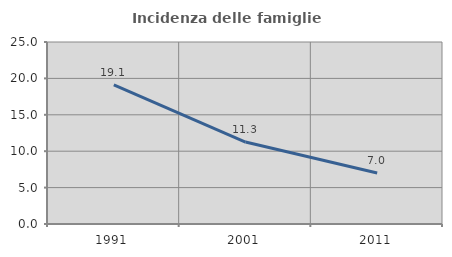
| Category | Incidenza delle famiglie numerose |
|---|---|
| 1991.0 | 19.104 |
| 2001.0 | 11.255 |
| 2011.0 | 6.997 |